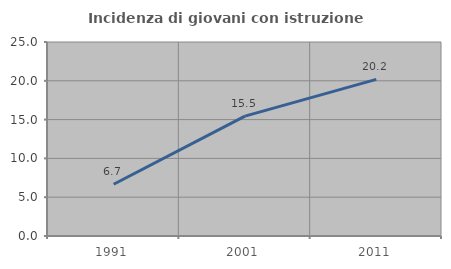
| Category | Incidenza di giovani con istruzione universitaria |
|---|---|
| 1991.0 | 6.667 |
| 2001.0 | 15.455 |
| 2011.0 | 20.183 |